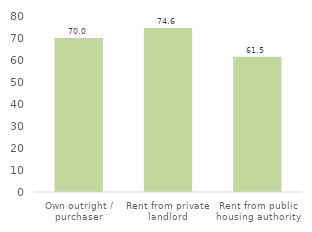
| Category | Series 0 |
|---|---|
| Own outright / purchaser | 70.041 |
| Rent from private landlord | 74.558 |
| Rent from public housing authority | 61.473 |